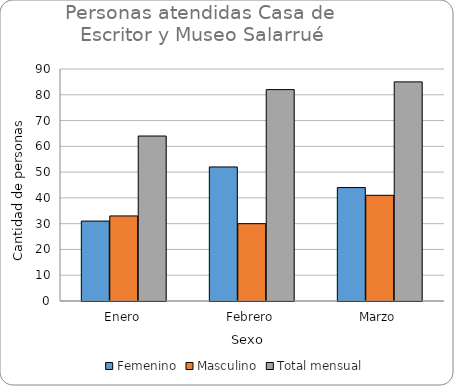
| Category | Femenino | Masculino | Total mensual  |
|---|---|---|---|
| Enero | 31 | 33 | 64 |
| Febrero | 52 | 30 | 82 |
| Marzo | 44 | 41 | 85 |